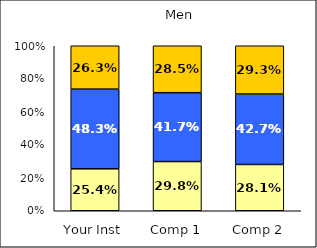
| Category | Low Pluralistic Orientation | Average Pluralistic Orientation | High Pluralistic Orientation |
|---|---|---|---|
| Your Inst | 0.254 | 0.483 | 0.263 |
| Comp 1 | 0.298 | 0.417 | 0.285 |
| Comp 2 | 0.281 | 0.427 | 0.293 |